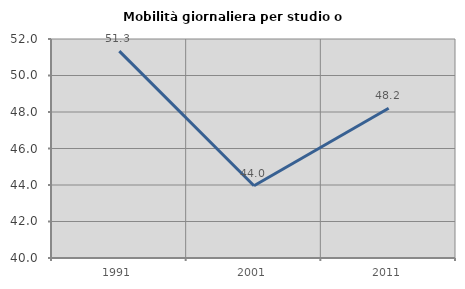
| Category | Mobilità giornaliera per studio o lavoro |
|---|---|
| 1991.0 | 51.335 |
| 2001.0 | 43.958 |
| 2011.0 | 48.204 |